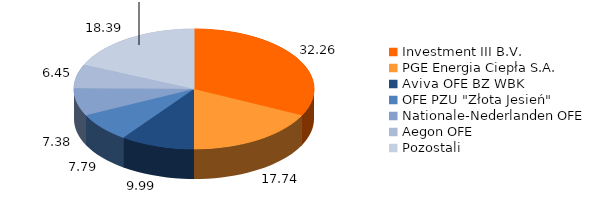
| Category | Series 2 | Series 3 | Series 1 | Series 0 |
|---|---|---|---|---|
| Investment III B.V.  | 32.263 | 0 | 4807132 | 4807132 |
| PGE Energia Ciepła S.A. | 17.737 | 32.263 | 2642869 | 2642869 |
| Aviva OFE BZ WBK | 9.993 | 17.737 | 1489000 | 1489000 |
| OFE PZU "Złota Jesień" | 7.785 | 9.993 | 1160000 | 1160000 |
| Nationale-Nederlanden OFE  | 7.383 | 7.785 | 1100000 | 1100000 |
| Aegon OFE | 6.448 | 7.383 | 960690 | 960690 |
| Pozostali | 18.391 | 6.448 | 2740309 | 2740309 |